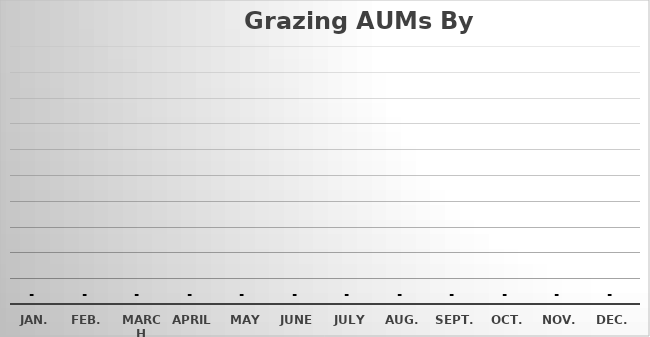
| Category | Series 0 |
|---|---|
| Jan. | 0 |
| Feb. | 0 |
| March | 0 |
| April | 0 |
| May | 0 |
| June | 0 |
| July | 0 |
| Aug. | 0 |
| Sept. | 0 |
| Oct. | 0 |
| Nov. | 0 |
| Dec. | 0 |